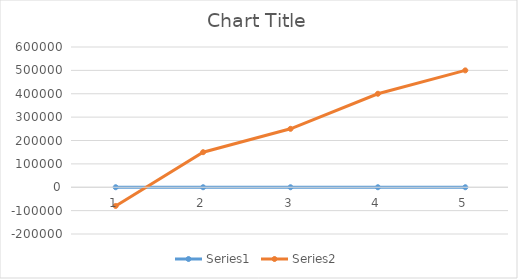
| Category | Series 0 | Series 1 |
|---|---|---|
| 0 | 1 | -80000 |
| 1 | 2 | 150000 |
| 2 | 3 | 250000 |
| 3 | 4 | 400000 |
| 4 | 5 | 500000 |